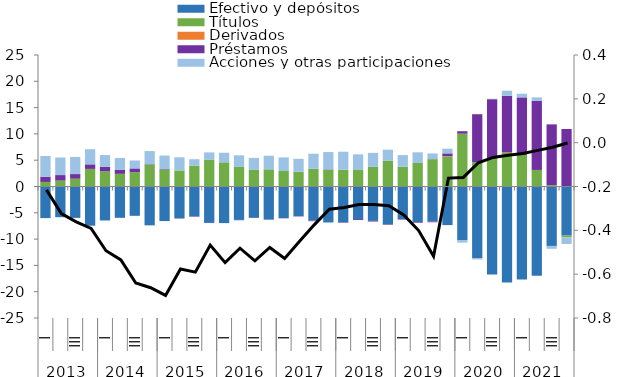
| Category | Efectivo y depósitos | Títulos | Derivados | Préstamos  | Acciones y otras participaciones  | Otras cuentas |
|---|---|---|---|---|---|---|
| 0 | -6.004 | 0.867 | 0 | 0.997 | 3.935 | -0.009 |
| 1 | -5.835 | 1.124 | 0 | 1.048 | 3.343 | -0.004 |
| 2 | -5.972 | 1.477 | 0 | 0.886 | 3.258 | -0.01 |
| 3 | -7.462 | 3.345 | 0 | 0.865 | 2.877 | -0.016 |
| 4 | -6.459 | 2.874 | 0 | 0.845 | 2.261 | -0.014 |
| 5 | -5.955 | 2.409 | 0 | 0.743 | 2.274 | -0.007 |
| 6 | -5.577 | 2.718 | 0 | 0.723 | 1.506 | -0.01 |
| 7 | -7.377 | 4.154 | 0 | 0.084 | 2.496 | -0.019 |
| 8 | -6.555 | 3.211 | 0 | 0.101 | 2.571 | -0.024 |
| 9 | -6.058 | 3.054 | -0.004 | -0.045 | 2.499 | -0.023 |
| 10 | -5.682 | 3.966 | -0.006 | -0.079 | 1.222 | -0.012 |
| 11 | -6.921 | 5.132 | -0.005 | -0.01 | 1.354 | -0.016 |
| 12 | -6.956 | 4.594 | -0.008 | 0.004 | 1.82 | -0.002 |
| 13 | -6.354 | 3.719 | -0.007 | -0.05 | 2.208 | 0.002 |
| 14 | -5.959 | 3.157 | -0.003 | -0.02 | 2.285 | 0 |
| 15 | -6.291 | 3.265 | -0.003 | -0.033 | 2.587 | -0.003 |
| 16 | -6.01 | 2.946 | -0.001 | -0.041 | 2.589 | -0.012 |
| 17 | -5.622 | 2.804 | -0.001 | -0.07 | 2.454 | -0.014 |
| 18 | -6.473 | 3.36 | -0.001 | -0.117 | 2.87 | -0.013 |
| 19 | -6.836 | 3.193 | -0.002 | 0.068 | 3.291 | -0.018 |
| 20 | -6.794 | 3.18 | 0 | -0.099 | 3.432 | -0.015 |
| 21 | -6.201 | 3.244 | 0 | -0.174 | 2.865 | -0.016 |
| 22 | -6.535 | 3.745 | 0 | -0.125 | 2.648 | -0.017 |
| 23 | -7.144 | 4.929 | 0 | -0.122 | 2.07 | -0.021 |
| 24 | -6.18 | 3.771 | 0 | -0.102 | 2.199 | -0.017 |
| 25 | -6.759 | 4.475 | 0 | -0.131 | 2.029 | -0.015 |
| 26 | -6.655 | 5.206 | 0 | -0.136 | 1.079 | -0.012 |
| 27 | -7.333 | 5.72 | 0.047 | 0.53 | 0.889 | -0.014 |
| 28 | -10.246 | 10.04 | -0.01 | 0.473 | -0.4 | -0.015 |
| 29 | -13.648 | 4.634 | -0.048 | 9.117 | -0.177 | 0.029 |
| 30 | -16.753 | 5.428 | -0.002 | 11.169 | 0.072 | 0.019 |
| 31 | -18.272 | 6.483 | 0 | 10.77 | 0.959 | 0.003 |
| 32 | -17.686 | 6.016 | 0 | 10.926 | 0.697 | -0.003 |
| 33 | -16.975 | 3.147 | 0 | 13.121 | 0.65 | 0.022 |
| 34 | -11.302 | 0.243 | 0 | 11.57 | -0.543 | 0.011 |
| 35 | -9.328 | -0.345 | 0 | 10.929 | -1.262 | 0.003 |